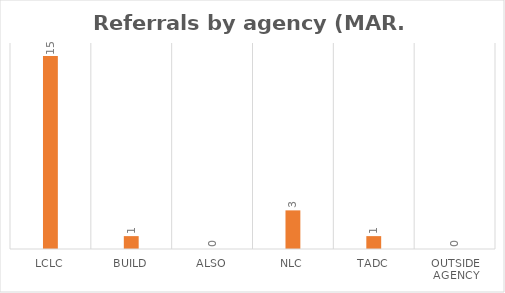
| Category | Series 0 |
|---|---|
| LCLC | 15 |
| BUILD | 1 |
| ALSO | 0 |
| NLC | 3 |
| TADC | 1 |
| Outside Agency | 0 |